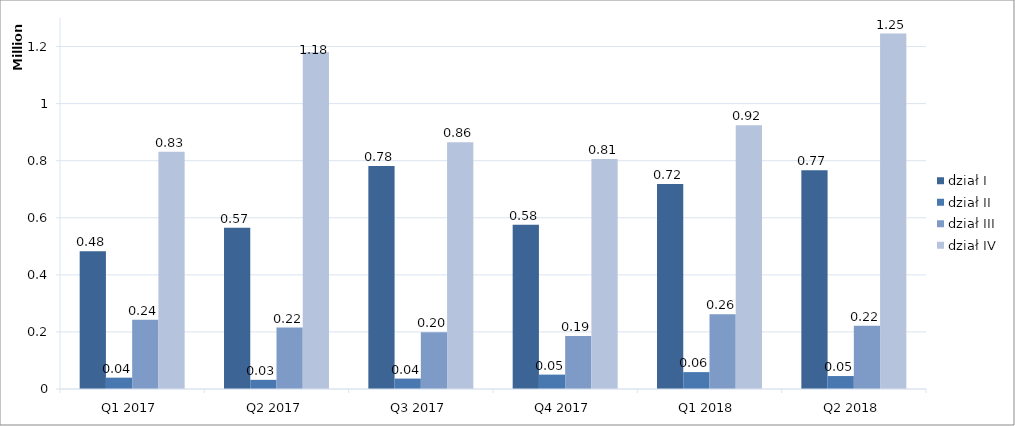
| Category | dział I | dział II | dział III | dział IV |
|---|---|---|---|---|
| Q1 2017 | 482512 | 39779 | 242399 | 831473 |
| Q2 2017 | 565403 | 32068 | 215189 | 1179973 |
| Q3 2017 | 781733 | 36564 | 198556 | 864292 |
| Q4 2017 | 575328 | 50414 | 185709 | 806076 |
| Q1 2018 | 718550 | 59143 | 261753 | 924593 |
| Q2 2018 | 766847 | 45432 | 221694 | 1245413 |